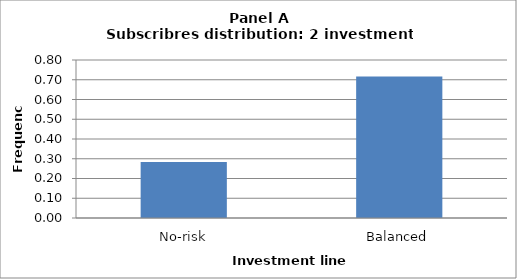
| Category | Series 0 |
|---|---|
| No-risk | 0.284 |
| Balanced | 0.716 |